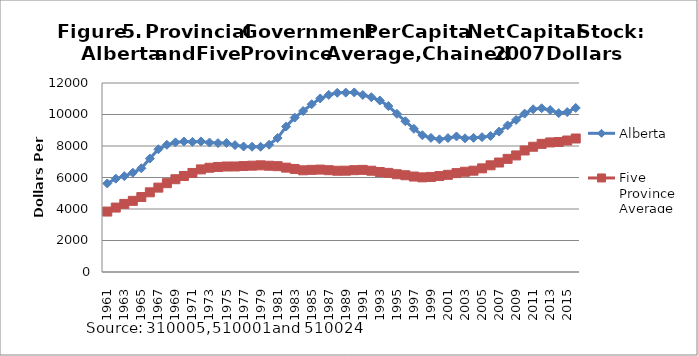
| Category | Alberta | Five Province Average |
|---|---|---|
| 1961.0 | 5620.871 | 3837.956 |
| 1962.0 | 5924.763 | 4090.948 |
| 1963.0 | 6084.818 | 4324.065 |
| 1964.0 | 6300 | 4518.001 |
| 1965.0 | 6583.448 | 4759.315 |
| 1966.0 | 7202.023 | 5058.598 |
| 1967.0 | 7793.289 | 5357.854 |
| 1968.0 | 8075.459 | 5639.102 |
| 1969.0 | 8228.993 | 5890.317 |
| 1970.0 | 8285.266 | 6096.051 |
| 1971.0 | 8263.108 | 6289.516 |
| 1972.0 | 8289.406 | 6514.198 |
| 1973.0 | 8219.311 | 6619.908 |
| 1974.0 | 8185.243 | 6668.706 |
| 1975.0 | 8191.016 | 6696.868 |
| 1976.0 | 8055.478 | 6700.324 |
| 1977.0 | 7968.123 | 6727.066 |
| 1978.0 | 7953.058 | 6750.673 |
| 1979.0 | 7951.488 | 6772.298 |
| 1980.0 | 8079.765 | 6746.831 |
| 1981.0 | 8505.07 | 6718.927 |
| 1982.0 | 9234.007 | 6626.751 |
| 1983.0 | 9802.025 | 6543.394 |
| 1984.0 | 10224.708 | 6456.971 |
| 1985.0 | 10653.403 | 6485.507 |
| 1986.0 | 11018.813 | 6502.524 |
| 1987.0 | 11243.09 | 6463.532 |
| 1988.0 | 11379.484 | 6429.482 |
| 1989.0 | 11389.231 | 6432.279 |
| 1990.0 | 11400.87 | 6464.924 |
| 1991.0 | 11240.185 | 6485.049 |
| 1992.0 | 11097.85 | 6430.497 |
| 1993.0 | 10888.197 | 6348.404 |
| 1994.0 | 10535.783 | 6292.706 |
| 1995.0 | 10042.717 | 6206.938 |
| 1996.0 | 9572.875 | 6142.858 |
| 1997.0 | 9091.301 | 6061.01 |
| 1998.0 | 8684.521 | 6008.212 |
| 1999.0 | 8515.958 | 6036.099 |
| 2000.0 | 8423.546 | 6092.991 |
| 2001.0 | 8504.018 | 6170.282 |
| 2002.0 | 8606.057 | 6279.115 |
| 2003.0 | 8488.613 | 6364.824 |
| 2004.0 | 8518.747 | 6431.804 |
| 2005.0 | 8561.74 | 6579.967 |
| 2006.0 | 8635.452 | 6774.212 |
| 2007.0 | 8913.41 | 6950.989 |
| 2008.0 | 9307.642 | 7183.016 |
| 2009.0 | 9657.818 | 7401.339 |
| 2010.0 | 10056.334 | 7714.563 |
| 2011.0 | 10333.252 | 7952.567 |
| 2012.0 | 10395.658 | 8135.367 |
| 2013.0 | 10282.52 | 8227.091 |
| 2014.0 | 10090.02 | 8255.004 |
| 2015.0 | 10156.727 | 8348.955 |
| 2016.0 | 10415.27 | 8475.402 |